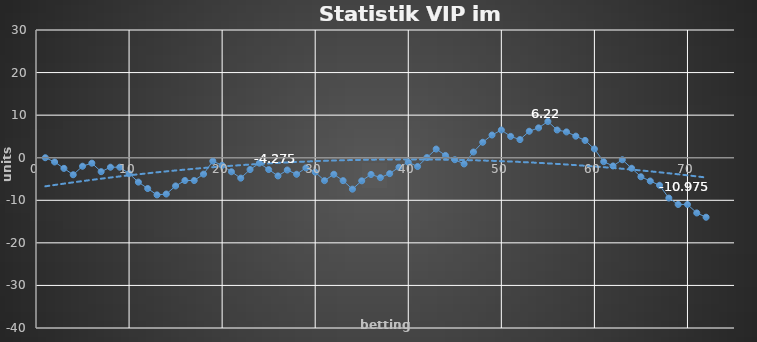
| Category | Series 0 |
|---|---|
| 0 | 0 |
| 1 | -1 |
| 2 | -2.5 |
| 3 | -4 |
| 4 | -2 |
| 5 | -1.28 |
| 6 | -3.28 |
| 7 | -2.23 |
| 8 | -2.23 |
| 9 | -3.73 |
| 10 | -5.73 |
| 11 | -7.23 |
| 12 | -8.73 |
| 13 | -8.53 |
| 14 | -6.63 |
| 15 | -5.355 |
| 16 | -5.355 |
| 17 | -3.855 |
| 18 | -0.795 |
| 19 | -1.795 |
| 20 | -3.295 |
| 21 | -4.795 |
| 22 | -2.775 |
| 23 | -1.275 |
| 24 | -2.775 |
| 25 | -4.275 |
| 26 | -2.885 |
| 27 | -3.885 |
| 28 | -2.385 |
| 29 | -3.385 |
| 30 | -5.385 |
| 31 | -3.885 |
| 32 | -5.385 |
| 33 | -7.385 |
| 34 | -5.425 |
| 35 | -3.925 |
| 36 | -4.675 |
| 37 | -3.735 |
| 38 | -2.235 |
| 39 | -1.065 |
| 40 | -2.065 |
| 41 | 0.035 |
| 42 | 2.035 |
| 43 | 0.535 |
| 44 | -0.465 |
| 45 | -1.465 |
| 46 | 1.335 |
| 47 | 3.63 |
| 48 | 5.33 |
| 49 | 6.51 |
| 50 | 5.01 |
| 51 | 4.26 |
| 52 | 6.22 |
| 53 | 7.015 |
| 54 | 8.515 |
| 55 | 6.515 |
| 56 | 6.065 |
| 57 | 5.065 |
| 58 | 4.065 |
| 59 | 2.065 |
| 60 | -0.935 |
| 61 | -1.935 |
| 62 | -0.475 |
| 63 | -2.475 |
| 64 | -4.475 |
| 65 | -5.475 |
| 66 | -6.475 |
| 67 | -9.475 |
| 68 | -10.975 |
| 69 | -10.975 |
| 70 | -12.975 |
| 71 | -13.975 |